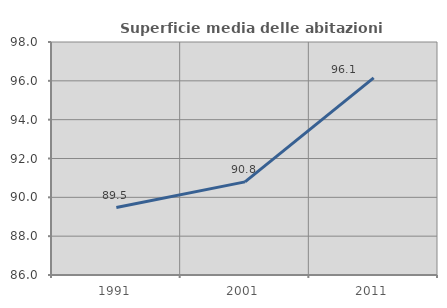
| Category | Superficie media delle abitazioni occupate |
|---|---|
| 1991.0 | 89.474 |
| 2001.0 | 90.797 |
| 2011.0 | 96.149 |